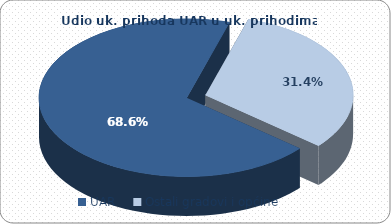
| Category | Ukupni prihodi |
|---|---|
| UAR | 25744978.162 |
| Ostali gradovi i općine | 11804562.571 |